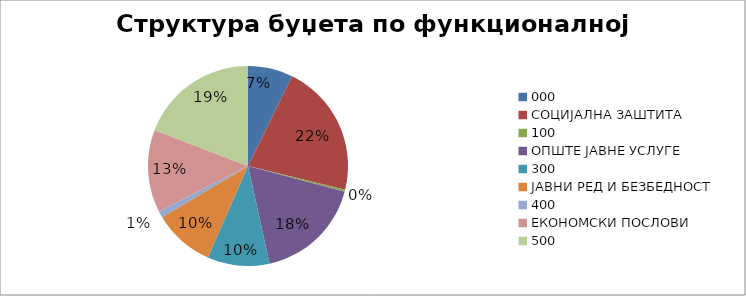
| Category | Series 0 |
|---|---|
| 0 | 60650000 |
| 1 | 179767641 |
| 2 | 2700000 |
| 3 | 145050000 |
| 4 | 83750000 |
| 5 | 82090000 |
| 6 | 9000000 |
| 7 | 110982359 |
| 8 | 160100000 |